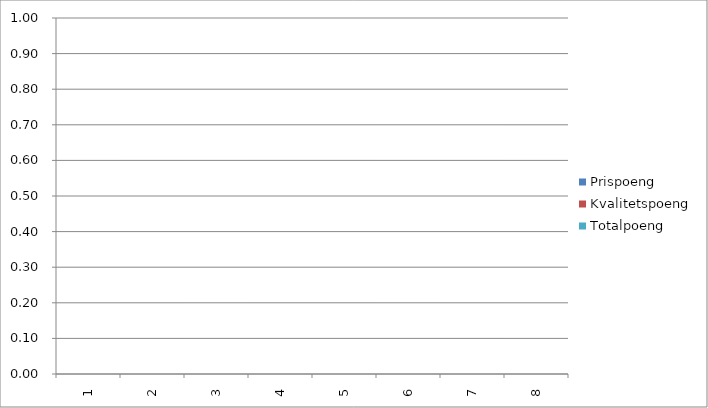
| Category | Prispoeng | Kvalitetspoeng | Miljøpoeng | Series 3 | Totalpoeng |
|---|---|---|---|---|---|
| 0 | 0 | 0 |  |  | 0 |
| 1 | 0 | 0 |  |  | 0 |
| 2 | 0 | 0 |  |  | 0 |
| 3 | 0 | 0 |  |  | 0 |
| 4 | 0 | 0 |  |  | 0 |
| 5 | 0 | 0 |  |  | 0 |
| 6 | 0 | 0 |  |  | 0 |
| 7 | 0 | 0 |  |  | 0 |